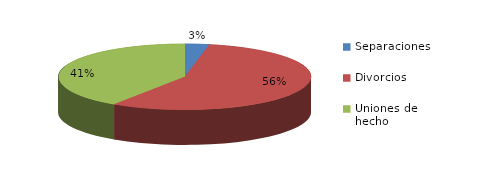
| Category | Series 0 |
|---|---|
| Separaciones | 26 |
| Divorcios | 469 |
| Uniones de hecho | 339 |